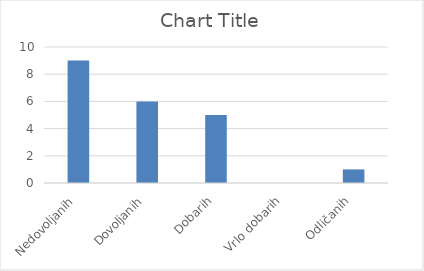
| Category | Series 0 |
|---|---|
| Nedovoljanih | 9 |
| Dovoljanih | 6 |
| Dobarih | 5 |
| Vrlo dobarih | 0 |
| Odličanih | 1 |